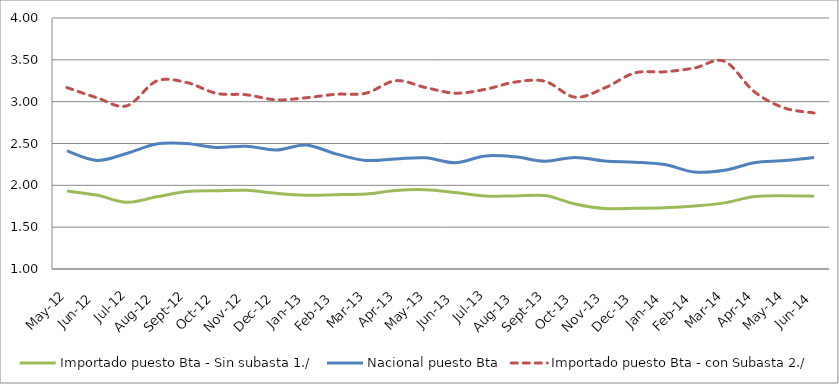
| Category | Importado puesto Bta - Sin subasta 1./ | Nacional puesto Bta | Importado puesto Bta - con Subasta 2./ |
|---|---|---|---|
| 2012-05-01 | 1.933 | 2.411 | 3.168 |
| 2012-06-01 | 1.883 | 2.297 | 3.048 |
| 2012-07-01 | 1.798 | 2.381 | 2.95 |
| 2012-08-01 | 1.862 | 2.493 | 3.246 |
| 2012-09-01 | 1.926 | 2.5 | 3.23 |
| 2012-10-01 | 1.936 | 2.452 | 3.1 |
| 2012-11-01 | 1.941 | 2.468 | 3.082 |
| 2012-12-01 | 1.905 | 2.422 | 3.022 |
| 2013-01-01 | 1.883 | 2.483 | 3.047 |
| 2013-02-01 | 1.888 | 2.376 | 3.088 |
| 2013-03-01 | 1.895 | 2.298 | 3.101 |
| 2013-04-01 | 1.938 | 2.315 | 3.25 |
| 2013-05-01 | 1.947 | 2.33 | 3.169 |
| 2013-06-01 | 1.914 | 2.27 | 3.102 |
| 2013-07-01 | 1.873 | 2.352 | 3.147 |
| 2013-08-01 | 1.873 | 2.341 | 3.235 |
| 2013-09-01 | 1.877 | 2.288 | 3.243 |
| 2013-10-01 | 1.777 | 2.334 | 3.054 |
| 2013-11-01 | 1.723 | 2.291 | 3.166 |
| 2013-12-01 | 1.726 | 2.277 | 3.343 |
| 2014-01-01 | 1.732 | 2.249 | 3.357 |
| 2014-02-01 | 1.753 | 2.16 | 3.402 |
| 2014-03-01 | 1.79 | 2.179 | 3.483 |
| 2014-04-01 | 1.866 | 2.271 | 3.119 |
| 2014-05-01 | 1.877 | 2.295 | 2.925 |
| 2014-06-01 | 1.869 | 2.331 | 2.865 |